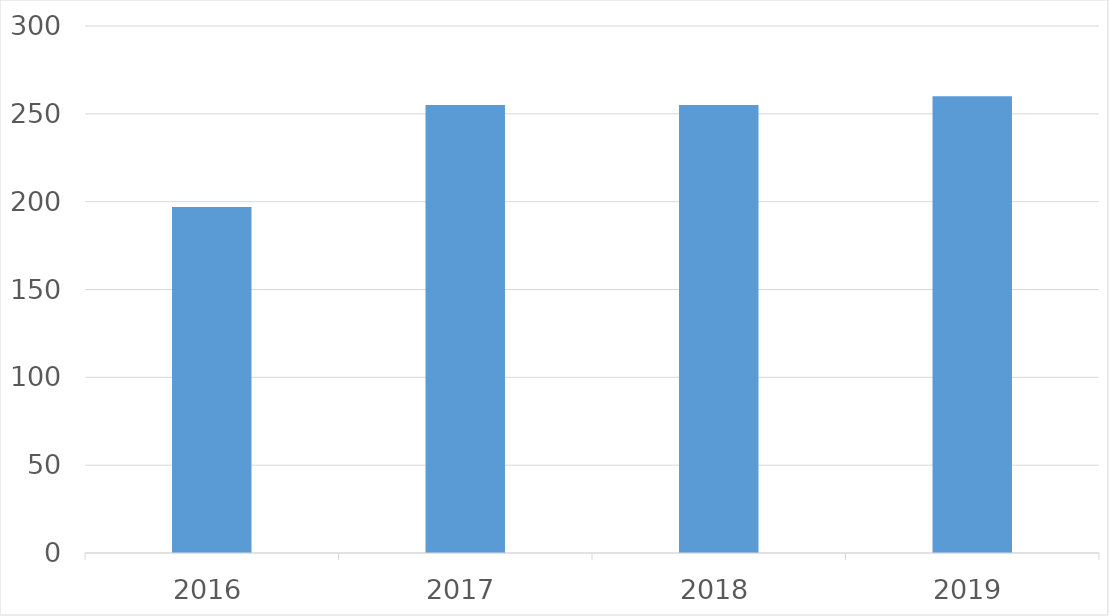
| Category | Series 0 |
|---|---|
| 2016 | 197 |
| 2017 | 255 |
| 2018 | 255 |
| 2019 | 260 |